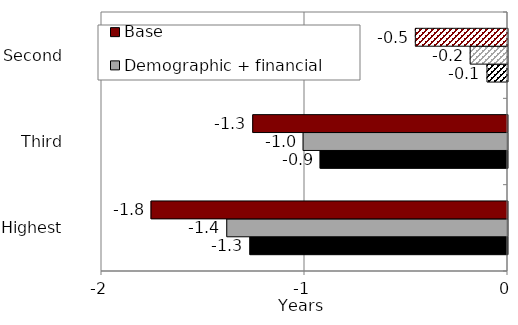
| Category | Demographic + financial + shocks | Demographic + financial | Base |
|---|---|---|---|
| Highest | -1.269 | -1.383 | -1.756 |
| Third | -0.923 | -1.007 | -1.255 |
| Second | -0.101 | -0.184 | -0.454 |